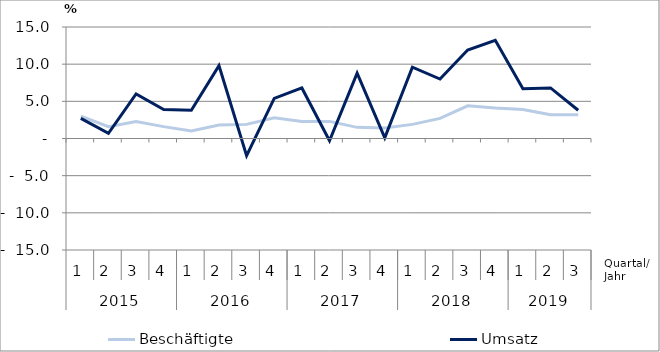
| Category | Beschäftigte | Umsatz |
|---|---|---|
| 0 | 3 | 2.7 |
| 1 | 1.6 | 0.7 |
| 2 | 2.3 | 6 |
| 3 | 1.6 | 3.9 |
| 4 | 1 | 3.8 |
| 5 | 1.8 | 9.8 |
| 6 | 1.9 | -2.3 |
| 7 | 2.8 | 5.4 |
| 8 | 2.3 | 6.8 |
| 9 | 2.3 | -0.3 |
| 10 | 1.5 | 8.8 |
| 11 | 1.4 | 0.1 |
| 12 | 1.9 | 9.6 |
| 13 | 2.7 | 8 |
| 14 | 4.4 | 11.9 |
| 15 | 4.1 | 13.2 |
| 16 | 3.9 | 6.7 |
| 17 | 3.2 | 6.8 |
| 18 | 3.2 | 3.8 |